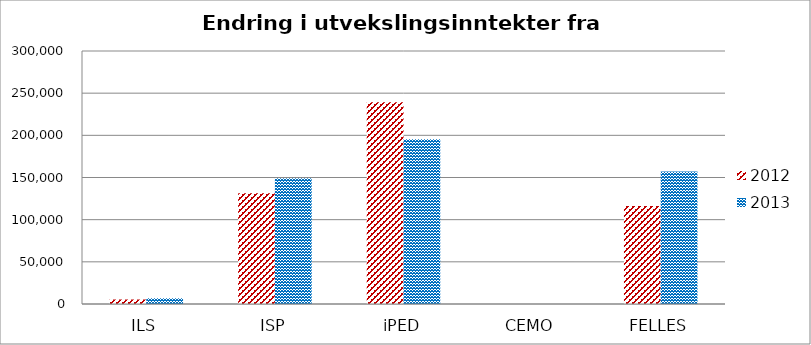
| Category | 2012 | 2013 |
|---|---|---|
| ILS | 5467 | 6833.333 |
| ISP | 131200 | 148966.667 |
| iPED | 239167 | 195433.333 |
| CEMO | 0 | 0 |
| FELLES | 116167 | 157166.667 |